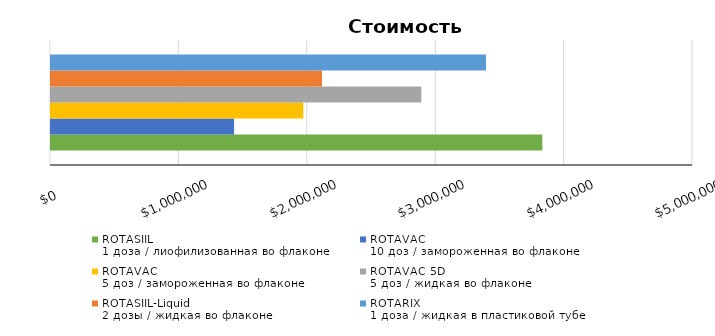
| Category | ROTASIIL
1 доза / лиофилизованная во флаконе | ROTAVAC
10 доз / замороженная во флаконе | ROTAVAC
5 доз / замороженная во флаконе | ROTAVAC 5D
5 доз / жидкая во флаконе | ROTASIIL-Liquid
2 дозы / жидкая во флаконе | ROTARIX
1 доза / жидкая в пластиковой тубе |
|---|---|---|---|---|---|---|
| Всего
на 5 лет | 3826813.368 | 1425944.668 | 1965016.287 | 2883898.053 | 2110523.881 | 3387892.606 |